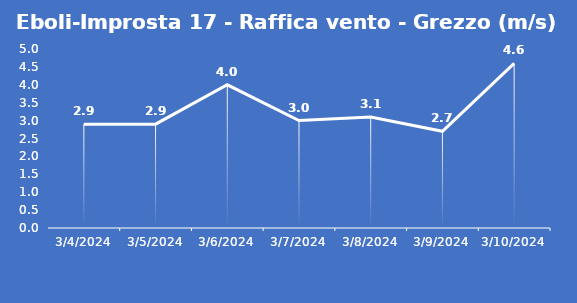
| Category | Eboli-Improsta 17 - Raffica vento - Grezzo (m/s) |
|---|---|
| 3/4/24 | 2.9 |
| 3/5/24 | 2.9 |
| 3/6/24 | 4 |
| 3/7/24 | 3 |
| 3/8/24 | 3.1 |
| 3/9/24 | 2.7 |
| 3/10/24 | 4.6 |